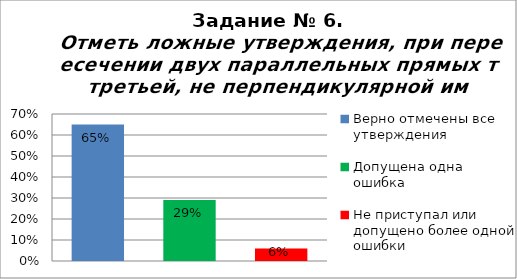
| Category | Отметь ложные утверждения, при пересечении двух параллельных прямых третьей, не перпендикулярной им. |
|---|---|
| Верно отмечены все утверждения | 0.65 |
| Допущена одна ошибка | 0.29 |
| Не приступал или допущено более одной ошибки | 0.06 |